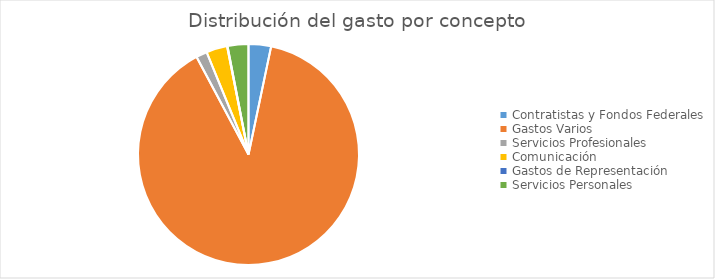
| Category | Series 0 |
|---|---|
| Contratistas y Fondos Federales | 16041110.25 |
| Gastos Varios | 434019136.22 |
| Servicios Profesionales | 7837770.16 |
| Comunicación | 14969886.91 |
| Gastos de Representación | 321949.12 |
| Servicios Personales | 14879152.46 |